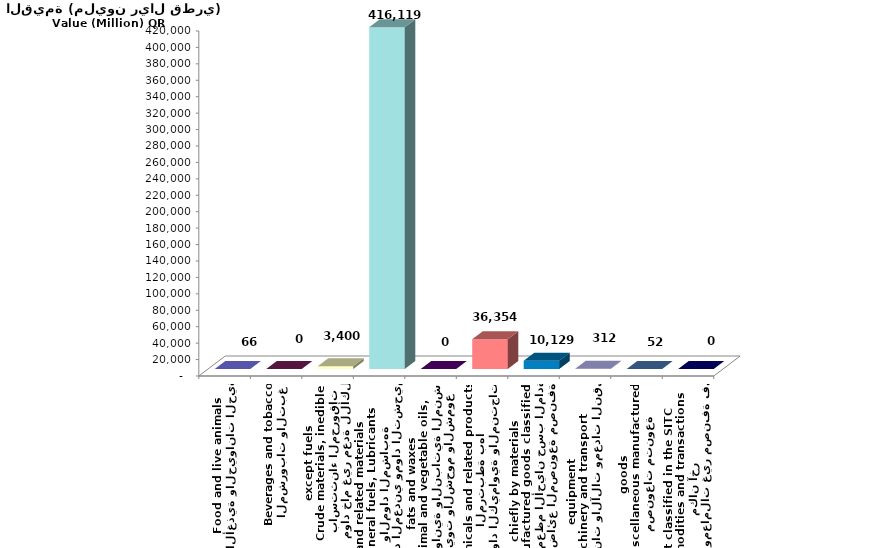
| Category | Series 0 |
|---|---|
| الأغذية والحيوانات الحية
Food and live animals | 65.986 |
| المشروبات والتبغ
Beverages and tobacco | 0.321 |
| مواد خام غير معدة للأكل
باستثناء المحروقات
Crude materials, inedible
except fuels | 3399.96 |
| الوقود المعدني ومواد التشحيم
والمواد المشابهة
Mineral fuels, Lubricants
and related materials | 416119.061 |
| الزيوت والشحوم والشموع
الحيوانية والنباتية المنشأ
Animal and vegetable oils,
fats and waxes | 0.227 |
| المواد الكيماوية والمنتجات المرتبطة بها
Chemicals and related products | 36354.216 |
| البضائع المصنوعة مصنفة
في معظم الأحيان حسب المادة
Manufactured goods classified 
chiefly by materials | 10128.506 |
| الماكينات والآلات ومعدات النقل
Machinery and transport
equipment | 312.204 |
| مصنوعات متنوعة
Miscellaneous manufactured
goods | 52.429 |
| أصناف ومعاملات غير مصنفة في مكان آخر
Commodities and transactions
not classified in the SITC | 0.177 |